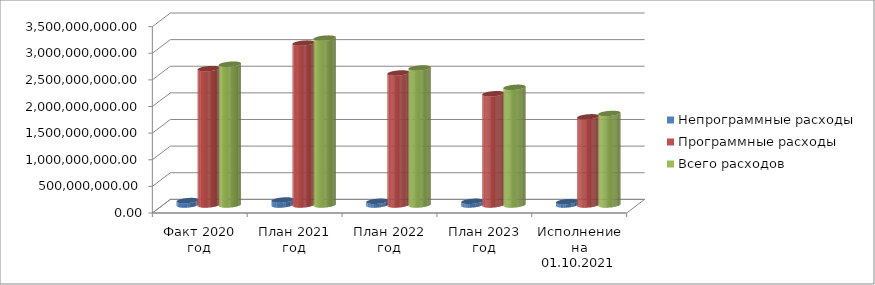
| Category | Непрограммные расходы | Программные расходы | Всего расходов |
|---|---|---|---|
| Факт 2020 год | 83148306 | 2561058133.41 | 2644206439.41 |
| План 2021 год | 93845901.98 | 3040653426.69 | 3134499328.67 |
| План 2022 год | 69635920 | 2479354316.09 | 2573350236.09 |
| План 2023 год | 69331020 | 2089976785.64 | 2209927805.64 |
| Исполнение на 01.10.2021 года | 63281325.56 | 1656040614.92 | 1719321940.48 |